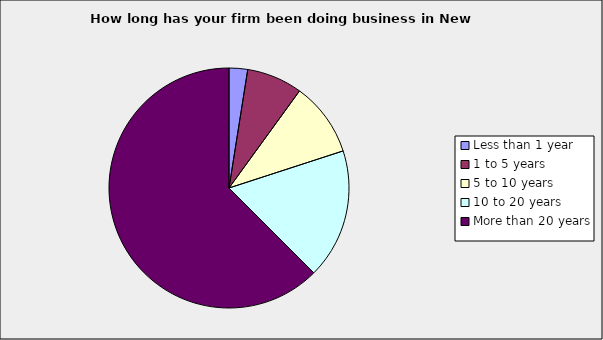
| Category | Series 0 |
|---|---|
| Less than 1 year | 0.025 |
| 1 to 5 years | 0.075 |
| 5 to 10 years | 0.1 |
| 10 to 20 years | 0.175 |
| More than 20 years | 0.625 |